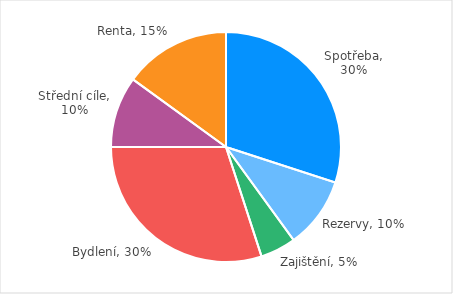
| Category | Series 0 |
|---|---|
| Spotřeba | 0.3 |
| Rezervy | 0.1 |
| Zajištění | 0.05 |
| Bydlení | 0.3 |
| Střední cíle | 0.1 |
| Renta | 0.15 |